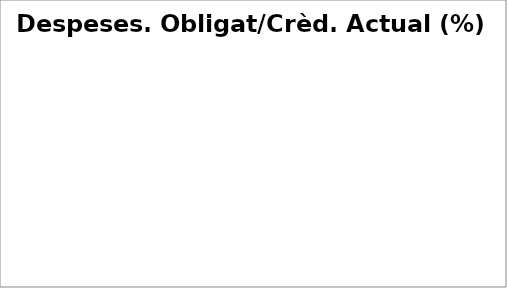
| Category | Series 0 |
|---|---|
| Despeses de personal | 0.505 |
| Despeses en béns corrents i serveis | 0.293 |
| Despeses financeres | 0.264 |
| Transferències corrents | 0.444 |
| Fons de contingència | 0 |
| Inversions reals | 0.288 |
| Transferències de capital | 0.005 |
| Actius financers | 0.493 |
| Passius financers | 0.292 |